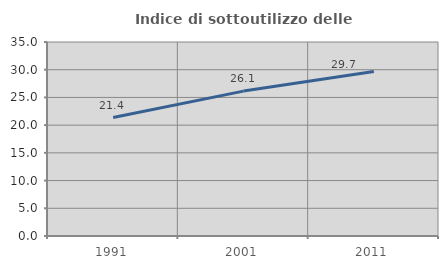
| Category | Indice di sottoutilizzo delle abitazioni  |
|---|---|
| 1991.0 | 21.373 |
| 2001.0 | 26.142 |
| 2011.0 | 29.681 |